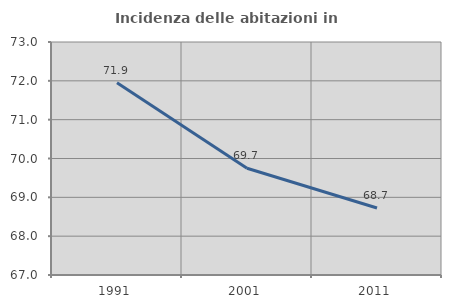
| Category | Incidenza delle abitazioni in proprietà  |
|---|---|
| 1991.0 | 71.95 |
| 2001.0 | 69.748 |
| 2011.0 | 68.725 |